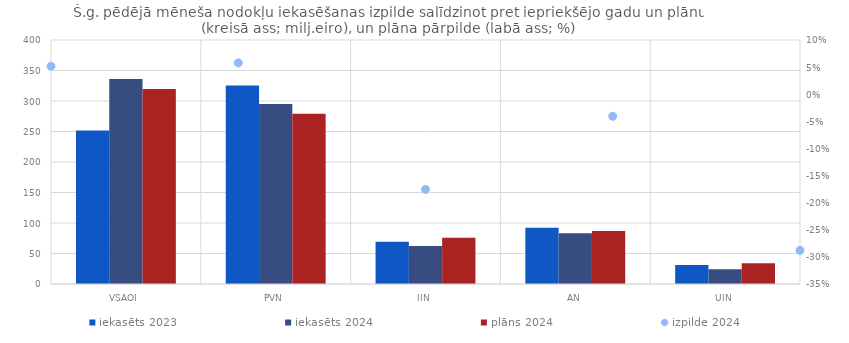
| Category | iekasēts 2023 | iekasēts 2024 | plāns 2024 |
|---|---|---|---|
| VSAOI | 251.649 | 336.269 | 319.773 |
| PVN | 325.432 | 295.025 | 278.9 |
| IIN | 69.21 | 62.493 | 75.8 |
| AN | 92.239 | 83.272 | 86.801 |
| UIN | 31.008 | 24.281 | 34.1 |